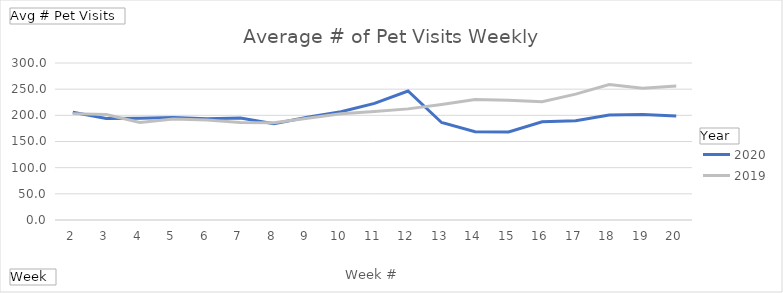
| Category | 2020 | 2019 |
|---|---|---|
| 2 | 205.892 | 203.265 |
| 3 | 194.02 | 201.392 |
| 4 | 194.627 | 186.49 |
| 5 | 195.971 | 192.833 |
| 6 | 193.627 | 190.873 |
| 7 | 194.99 | 186.118 |
| 8 | 184.049 | 185.735 |
| 9 | 196.284 | 194.431 |
| 10 | 206.892 | 203.049 |
| 11 | 222.755 | 207.167 |
| 12 | 246.51 | 212.333 |
| 13 | 186.255 | 220.814 |
| 14 | 168.529 | 230.235 |
| 15 | 168.206 | 228.961 |
| 16 | 187.784 | 226.167 |
| 17 | 189.618 | 240.48 |
| 18 | 200.426 | 258.794 |
| 19 | 201.396 | 251.912 |
| 20 | 198.782 | 255.882 |